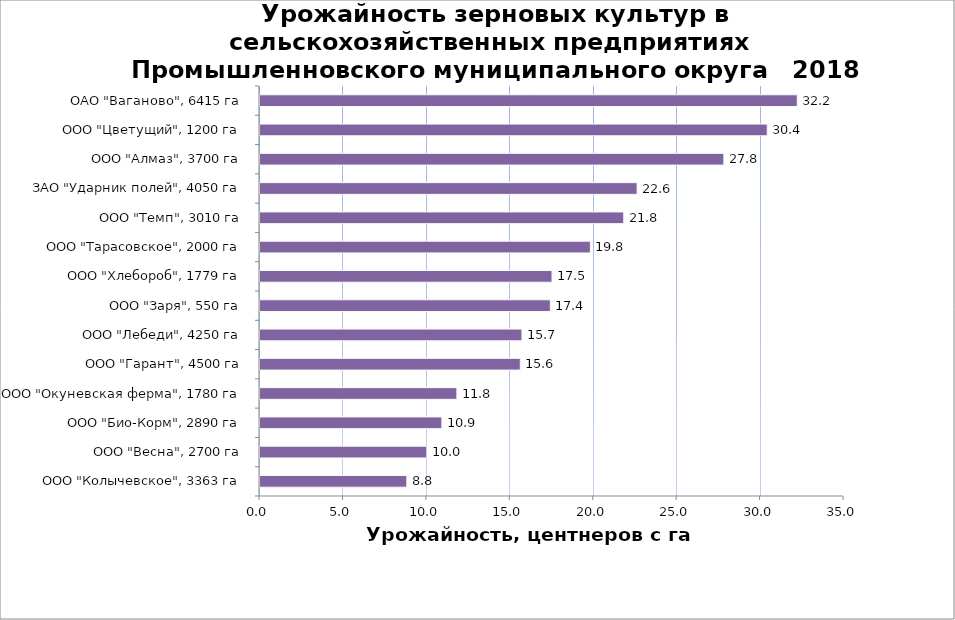
| Category | Series 0 |
|---|---|
| ООО "Колычевское", 3363 га | 8.8 |
| ООО "Весна", 2700 га | 10 |
| ООО "Био-Корм", 2890 га | 10.9 |
| ООО "Окуневская ферма", 1780 га | 11.8 |
| ООО "Гарант", 4500 га | 15.6 |
| ООО "Лебеди", 4250 га | 15.7 |
| ООО "Заря", 550 га | 17.4 |
| ООО "Хлебороб", 1779 га | 17.5 |
| ООО "Тарасовское", 2000 га | 19.8 |
| ООО "Темп", 3010 га | 21.8 |
| ЗАО "Ударник полей", 4050 га | 22.6 |
| ООО "Алмаз", 3700 га | 27.8 |
| ООО "Цветущий", 1200 га | 30.4 |
| ОАО "Ваганово", 6415 га | 32.2 |